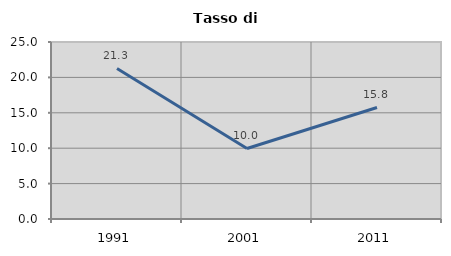
| Category | Tasso di disoccupazione   |
|---|---|
| 1991.0 | 21.267 |
| 2001.0 | 9.96 |
| 2011.0 | 15.756 |